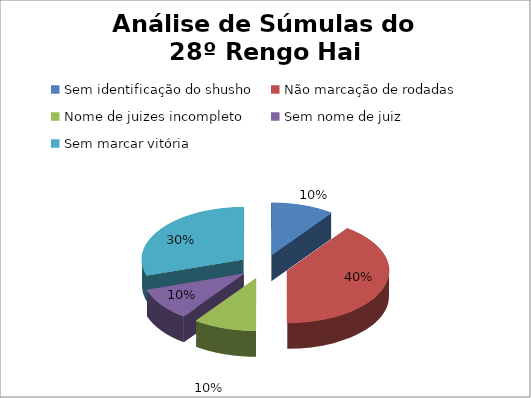
| Category | Series 1 | Series 0 |
|---|---|---|
| Sem identificação do shusho | 0.091 | 1 |
| Não marcação de rodadas | 0.364 | 4 |
| Nome de juizes incompleto | 0.091 | 1 |
| Sem nome de juiz  | 0.091 | 1 |
| Sem marcar vitória | 0.273 | 3 |